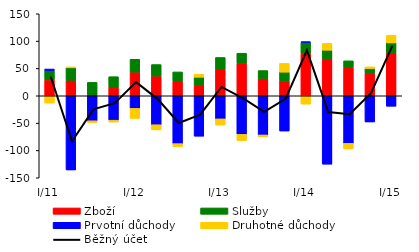
| Category | Zboží | Služby | Prvotní důchody | Druhotné důchody |
|---|---|---|---|---|
| I/11 | 28.994 | 17.24 | 2.716 | -13.37 |
| II | 28.218 | 22.874 | -135.675 | 1.741 |
| III | 1.774 | 22.739 | -45.729 | -3.187 |
| IV | 16.492 | 18.43 | -44.657 | -3.399 |
| I/12 | 43.281 | 23.478 | -23.083 | -18.258 |
| II | 36.152 | 20.972 | -52.981 | -9.36 |
| III | 25.681 | 17.923 | -87.565 | -5.364 |
| IV | 18.683 | 15.252 | -73.899 | 5.772 |
| I/13 | 48.355 | 21.702 | -42.281 | -11.28 |
| II | 59.692 | 18.186 | -70.624 | -11.218 |
| III | 31.672 | 14.458 | -71.638 | -3.56 |
| IV | 27.254 | 16.013 | -64.475 | 15.96 |
| I/14 | 77.394 | 20.418 | 1.008 | -15.254 |
| II | 68.219 | 15.152 | -125.09 | 12.495 |
| III | 51.694 | 12.235 | -87.004 | -10.21 |
| IV | 41.587 | 8.072 | -47.876 | 3.26 |
| I/15 | 78.922 | 17.809 | -19.105 | 13.923 |